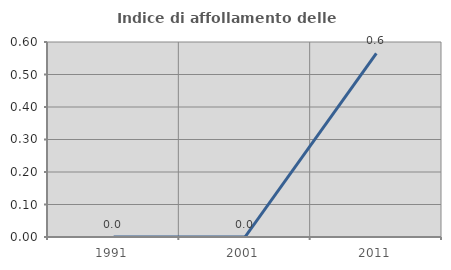
| Category | Indice di affollamento delle abitazioni  |
|---|---|
| 1991.0 | 0 |
| 2001.0 | 0 |
| 2011.0 | 0.565 |